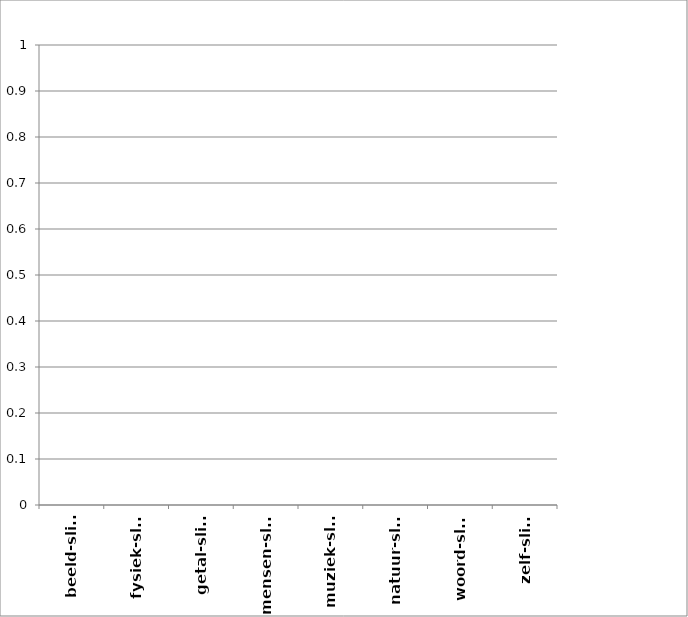
| Category | Series 0 |
|---|---|
| beeld-slim | 0 |
| fysiek-slim | 0 |
| getal-slim | 0 |
| mensen-slim | 0 |
| muziek-slim | 0 |
| natuur-slim | 0 |
| woord-slim | 0 |
| zelf-slim | 0 |